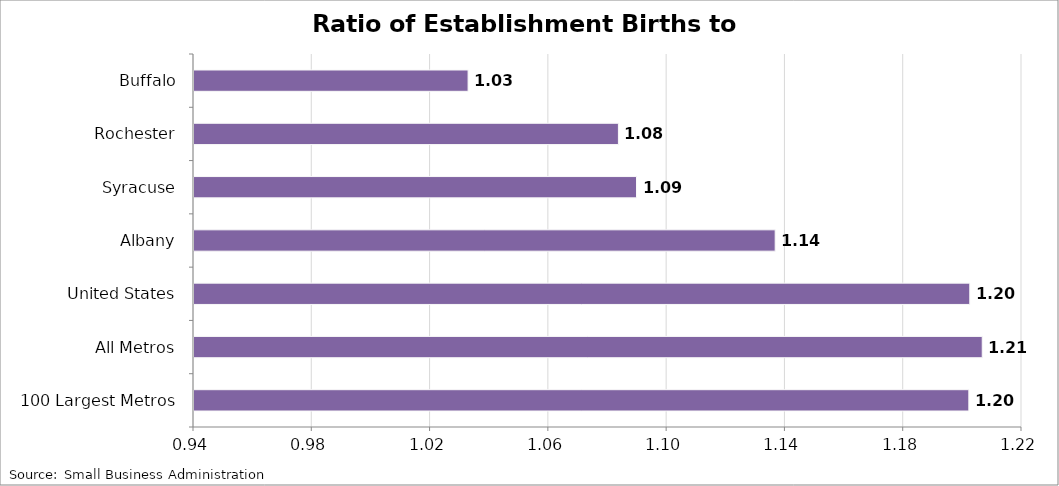
| Category | Ratio of Establishment Births to Deaths |
|---|---|
| 100 Largest Metros | 1.202 |
| All Metros | 1.207 |
| United States | 1.202 |
| Albany | 1.137 |
| Syracuse | 1.09 |
| Rochester | 1.084 |
| Buffalo | 1.033 |